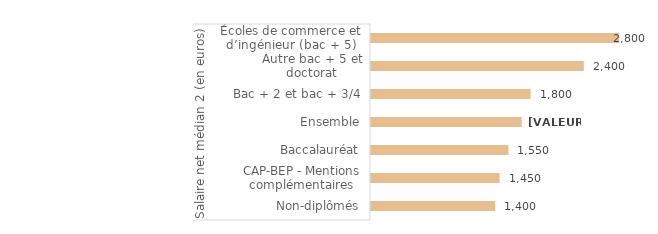
| Category | Series 0 |
|---|---|
| 0 | 1400 |
| 1 | 1450 |
| 2 | 1550 |
| 3 | 1700 |
| 4 | 1800 |
| 5 | 2400 |
| 6 | 2800 |